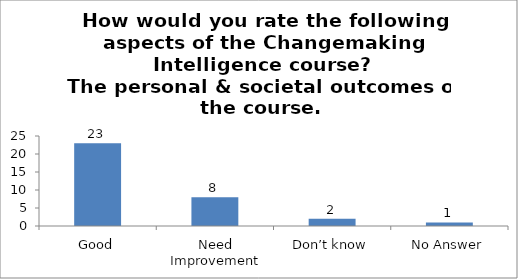
| Category | How would you rate the following aspects of the Changemaking Intelligence course?
The personal & societal outcomes of the course. |
|---|---|
| Good | 23 |
| Need Improvement | 8 |
| Don’t know | 2 |
| No Answer | 1 |